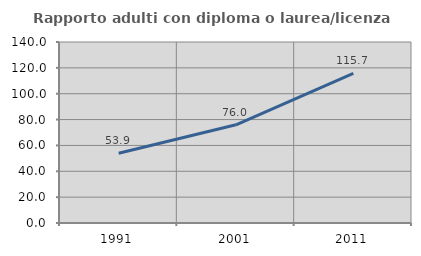
| Category | Rapporto adulti con diploma o laurea/licenza media  |
|---|---|
| 1991.0 | 53.945 |
| 2001.0 | 75.991 |
| 2011.0 | 115.705 |